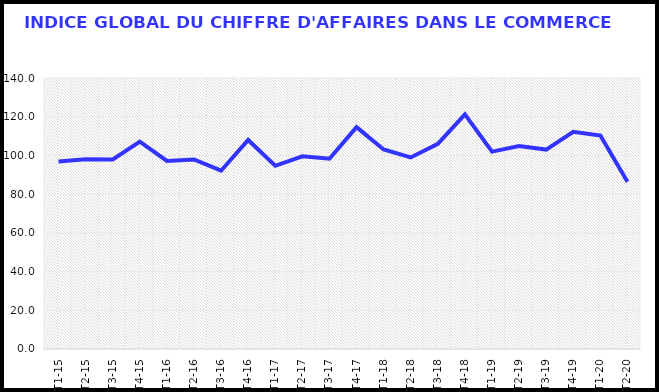
| Category | Series 0 |
|---|---|
| T1-15 | 96.879 |
| T2-15 | 98.085 |
| T3-15 | 97.905 |
| T4-15 | 107.131 |
| T1-16 | 97.159 |
| T2-16 | 97.948 |
| T3-16 | 92.107 |
| T4-16 | 107.998 |
| T1-17 | 94.646 |
| T2-17 | 99.526 |
| T3-17 | 98.276 |
| T4-17 | 114.632 |
| T1-18 | 103.041 |
| T2-18 | 98.939 |
| T3-18 | 105.963 |
| T4-18 | 121.219 |
| T1-19 | 101.968 |
| T2-19 | 104.849 |
| T3-19 | 103.019 |
| T4-19 | 112.171 |
| T1-20 | 110.298 |
| T2-20 | 86.426 |